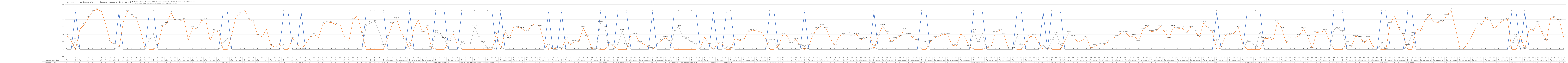
| Category | 1 = Strom reicht im Tagesdurchnitt aus | Zusätzlich benötigter Strom | Überschüssiger Strom |
|---|---|---|---|
| 0 | 0 | 0.36 | 0 |
| 1 | 0 | 0.23 | 0 |
| 2 | 1 | 0 | 0.25 |
| 3 | 0 | 0.54 | 0 |
| 4 | 0 | 0.66 | 0 |
| 5 | 0 | 0.85 | 0 |
| 6 | 0 | 1.02 | 0 |
| 7 | 0 | 1.07 | 0 |
| 8 | 0 | 1.01 | 0 |
| 9 | 0 | 0.65 | 0 |
| 10 | 0 | 0.21 | 0 |
| 11 | 0 | 0.12 | 0 |
| 12 | 1 | 0 | 0.09 |
| 13 | 0 | 0.73 | 0 |
| 14 | 0 | 1.02 | 0 |
| 15 | 0 | 0.9 | 0 |
| 16 | 0 | 0.83 | 0 |
| 17 | 0 | 0.49 | 0 |
| 18 | 0 | 0.02 | 0 |
| 19 | 1 | 0 | 0.25 |
| 20 | 1 | 0 | 0.4 |
| 21 | 0 | 0.1 | 0 |
| 22 | 0 | 0.61 | 0 |
| 23 | 0 | 0.69 | 0 |
| 24 | 0 | 0.98 | 0 |
| 25 | 0 | 0.76 | 0 |
| 26 | 0 | 0.76 | 0 |
| 27 | 0 | 0.8 | 0 |
| 28 | 0 | 0.25 | 0 |
| 29 | 0 | 0.58 | 0 |
| 30 | 0 | 0.55 | 0 |
| 31 | 0 | 0.77 | 0 |
| 32 | 0 | 0.79 | 0 |
| 33 | 0 | 0.23 | 0 |
| 34 | 0 | 0.5 | 0 |
| 35 | 0 | 0.47 | 0 |
| 36 | 1 | 0 | 0.16 |
| 37 | 1 | 0 | 0.3 |
| 38 | 0 | 0.39 | 0 |
| 39 | 0 | 0.89 | 0 |
| 40 | 0 | 0.95 | 0 |
| 41 | 0 | 1.05 | 0 |
| 42 | 0 | 0.8 | 0 |
| 43 | 0 | 0.74 | 0 |
| 44 | 0 | 0.37 | 0 |
| 45 | 0 | 0.34 | 0 |
| 46 | 0 | 0.54 | 0 |
| 47 | 0 | 0.11 | 0 |
| 48 | 0 | 0.06 | 0 |
| 49 | 0 | 0.13 | 0 |
| 50 | 1 | 0 | 0.14 |
| 51 | 1 | 0 | 0.01 |
| 52 | 0 | 0.29 | 0 |
| 53 | 0 | 0.16 | 0 |
| 54 | 1 | 0 | 0 |
| 55 | 0 | 0.14 | 0 |
| 56 | 0 | 0.32 | 0 |
| 57 | 0 | 0.39 | 0 |
| 58 | 0 | 0.32 | 0 |
| 59 | 0 | 0.68 | 0 |
| 60 | 0 | 0.71 | 0 |
| 61 | 0 | 0.72 | 0 |
| 62 | 0 | 0.66 | 0 |
| 63 | 0 | 0.65 | 0 |
| 64 | 0 | 0.33 | 0 |
| 65 | 0 | 0.22 | 0 |
| 66 | 0 | 0.8 | 0 |
| 67 | 0 | 0.9 | 0 |
| 68 | 0 | 0.43 | 0 |
| 69 | 1 | 0 | 0.63 |
| 70 | 1 | 0 | 0.71 |
| 71 | 1 | 0 | 0.75 |
| 72 | 1 | 0 | 0.46 |
| 73 | 1 | 0 | 0.11 |
| 74 | 0 | 0.335 | 0 |
| 75 | 0 | 0.683 | 0 |
| 76 | 0 | 0.822 | 0 |
| 77 | 0 | 0.459 | 0 |
| 78 | 0 | 0.265 | 0 |
| 79 | 1 | 0 | 0.195 |
| 80 | 0 | 0.568 | 0 |
| 81 | 0 | 0.78 | 0 |
| 82 | 0 | 0.454 | 0 |
| 83 | 0 | 0.6 | 0 |
| 84 | 0 | 0.055 | 0 |
| 85 | 1 | 0 | 0.484 |
| 86 | 1 | 0 | 0.402 |
| 87 | 1 | 0 | 0.297 |
| 88 | 0 | 0.206 | 0 |
| 89 | 0 | 0.437 | 0 |
| 90 | 0 | 0.115 | 0 |
| 91 | 1 | 0 | 0.189 |
| 92 | 1 | 0 | 0.142 |
| 93 | 1 | 0 | 0.144 |
| 94 | 1 | 0 | 0.606 |
| 95 | 1 | 0 | 0.315 |
| 96 | 1 | 0 | 0.189 |
| 97 | 1 | 0 | 0.021 |
| 98 | 1 | 0 | 0.059 |
| 99 | 0 | 0.428 | 0 |
| 100 | 1 | 0 | 0.063 |
| 101 | 0 | 0.473 | 0 |
| 102 | 0 | 0.298 | 0 |
| 103 | 0 | 0.597 | 0 |
| 104 | 0 | 0.587 | 0 |
| 105 | 0 | 0.546 | 0 |
| 106 | 0 | 0.465 | 0 |
| 107 | 0 | 0.616 | 0 |
| 108 | 0 | 0.701 | 0 |
| 109 | 0 | 0.61 | 0 |
| 110 | 0 | 0.166 | 0 |
| 111 | 1 | 0 | 0.17 |
| 112 | 0 | 0.034 | 0 |
| 113 | 0 | 0.014 | 0 |
| 114 | 1 | 0 | 0.016 |
| 115 | 0 | 0.277 | 0 |
| 116 | 0 | 0.123 | 0 |
| 117 | 0 | 0.2 | 0 |
| 118 | 0 | 0.21 | 0 |
| 119 | 0 | 0.573 | 0 |
| 120 | 0 | 0.335 | 0 |
| 121 | 0 | 0.028 | 0 |
| 122 | 0 | 0.003 | 0 |
| 123 | 1 | 0 | 0.71 |
| 124 | 1 | 0 | 0.582 |
| 125 | 0 | 0.155 | 0 |
| 126 | 0 | 0.092 | 0 |
| 127 | 1 | 0 | 0.142 |
| 128 | 1 | 0 | 0.5 |
| 129 | 1 | 0 | 0.131 |
| 130 | 0 | 0.379 | 0 |
| 131 | 0 | 0.395 | 0 |
| 132 | 0 | 0.188 | 0 |
| 133 | 0 | 0.143 | 0 |
| 134 | 0 | 0.064 | 0 |
| 135 | 1 | 0 | 0.021 |
| 136 | 0 | 0.129 | 0 |
| 137 | 0 | 0.236 | 0 |
| 138 | 0 | 0.309 | 0 |
| 139 | 0 | 0.217 | 0 |
| 140 | 1 | 0 | 0.482 |
| 141 | 1 | 0 | 0.617 |
| 142 | 1 | 0 | 0.307 |
| 143 | 1 | 0 | 0.283 |
| 144 | 1 | 0 | 0.189 |
| 145 | 1 | 0 | 0.138 |
| 146 | 0 | 0.052 | 0 |
| 147 | 0 | 0.329 | 0 |
| 148 | 0 | 0.128 | 0 |
| 149 | 1 | 0 | 0.035 |
| 150 | 0 | 0.156 | 0 |
| 151 | 0 | 0.146 | 0 |
| 152 | 1 | 0 | 0.05 |
| 153 | 1 | 0 | 0.014 |
| 154 | 0 | 0.307 | 0 |
| 155 | 0 | 0.234 | 0 |
| 156 | 0 | 0.255 | 0 |
| 157 | 0 | 0.469 | 0 |
| 158 | 0 | 0.512 | 0 |
| 159 | 0 | 0.495 | 0 |
| 160 | 0 | 0.461 | 0 |
| 161 | 0 | 0.3 | 0 |
| 162 | 1 | 0 | 0.274 |
| 163 | 1 | 0 | 0.243 |
| 164 | 0 | 0.101 | 0 |
| 165 | 0 | 0.393 | 0 |
| 166 | 0 | 0.369 | 0 |
| 167 | 0 | 0.144 | 0 |
| 168 | 0 | 0.27 | 0 |
| 169 | 0 | 0.095 | 0 |
| 170 | 1 | 0 | 0.077 |
| 171 | 0 | 0.095 | 0 |
| 172 | 0 | 0.406 | 0 |
| 173 | 0 | 0.563 | 0 |
| 174 | 0 | 0.63 | 0 |
| 175 | 0 | 0.556 | 0 |
| 176 | 0 | 0.273 | 0 |
| 177 | 0 | 0.11 | 0 |
| 178 | 0 | 0.355 | 0 |
| 179 | 0 | 0.403 | 0 |
| 180 | 0 | 0.415 | 0 |
| 181 | 0 | 0.351 | 0 |
| 182 | 0 | 0.399 | 0 |
| 183 | 0 | 0.258 | 0 |
| 184 | 0 | 0.293 | 0 |
| 185 | 0 | 0.408 | 0 |
| 186 | 1 | 0 | 0.065 |
| 187 | 0 | 0.367 | 0 |
| 188 | 0 | 0.629 | 0 |
| 189 | 0 | 0.448 | 0 |
| 190 | 0 | 0.191 | 0 |
| 191 | 0 | 0.281 | 0 |
| 192 | 0 | 0.35 | 0 |
| 193 | 0 | 0.528 | 0 |
| 194 | 0 | 0.402 | 0 |
| 195 | 0 | 0.31 | 0 |
| 196 | 0 | 0.235 | 0 |
| 197 | 1 | 0 | 0.063 |
| 198 | 1 | 0 | 0.187 |
| 199 | 0 | 0.206 | 0 |
| 200 | 0 | 0.309 | 0 |
| 201 | 0 | 0.354 | 0 |
| 202 | 0 | 0.404 | 0 |
| 203 | 0 | 0.388 | 0 |
| 204 | 0 | 0.11 | 0 |
| 205 | 0 | 0.093 | 0 |
| 206 | 0 | 0.41 | 0 |
| 207 | 0 | 0.329 | 0 |
| 208 | 0 | 0.066 | 0 |
| 209 | 1 | 0 | 0.493 |
| 210 | 1 | 0 | 0.182 |
| 211 | 1 | 0 | 0.433 |
| 212 | 0 | 0.042 | 0 |
| 213 | 0 | 0.071 | 0 |
| 214 | 0 | 0.441 | 0 |
| 215 | 0 | 0.51 | 0 |
| 216 | 0 | 0.389 | 0 |
| 217 | 0 | 0.012 | 0 |
| 218 | 0 | 0.011 | 0 |
| 219 | 1 | 0 | 0.358 |
| 220 | 1 | 0 | 0.112 |
| 221 | 0 | 0.184 | 0 |
| 222 | 0 | 0.34 | 0 |
| 223 | 0 | 0.36 | 0 |
| 224 | 0 | 0.168 | 0 |
| 225 | 1 | 0 | 0.116 |
| 226 | 0 | 0.036 | 0 |
| 227 | 1 | 0 | 0.242 |
| 228 | 1 | 0 | 0.43 |
| 229 | 1 | 0 | 0.129 |
| 230 | 0 | 0.223 | 0 |
| 231 | 0 | 0.451 | 0 |
| 232 | 0 | 0.331 | 0 |
| 233 | 0 | 0.194 | 0 |
| 234 | 0 | 0.249 | 0 |
| 235 | 0 | 0.314 | 0 |
| 236 | 0 | 0.019 | 0 |
| 237 | 0 | 0.095 | 0 |
| 238 | 0 | 0.122 | 0 |
| 239 | 0 | 0.118 | 0 |
| 240 | 0 | 0.198 | 0 |
| 241 | 0 | 0.302 | 0 |
| 242 | 0 | 0.341 | 0 |
| 243 | 0 | 0.444 | 0 |
| 244 | 0 | 0.445 | 0 |
| 245 | 0 | 0.329 | 0 |
| 246 | 0 | 0.361 | 0 |
| 247 | 0 | 0.216 | 0 |
| 248 | 0 | 0.534 | 0 |
| 249 | 0 | 0.615 | 0 |
| 250 | 0 | 0.472 | 0 |
| 251 | 0 | 0.495 | 0 |
| 252 | 0 | 0.613 | 0 |
| 253 | 0 | 0.47 | 0 |
| 254 | 0 | 0.296 | 0 |
| 255 | 0 | 0.6 | 0 |
| 256 | 0 | 0.55 | 0 |
| 257 | 0 | 0.576 | 0 |
| 258 | 0 | 0.432 | 0 |
| 259 | 0 | 0.59 | 0 |
| 260 | 0 | 0.477 | 0 |
| 261 | 0 | 0.331 | 0 |
| 262 | 0 | 0.714 | 0 |
| 263 | 0 | 0.548 | 0 |
| 264 | 0 | 0.476 | 0 |
| 265 | 1 | 0 | 0.242 |
| 266 | 0 | 0.041 | 0 |
| 267 | 0 | 0.369 | 0 |
| 268 | 0 | 0.396 | 0 |
| 269 | 0 | 0.43 | 0 |
| 270 | 0 | 0.579 | 0 |
| 271 | 0 | 0.143 | 0 |
| 272 | 1 | 0 | 0.215 |
| 273 | 1 | 0 | 0.205 |
| 274 | 1 | 0 | 0.042 |
| 275 | 1 | 0 | 0.487 |
| 276 | 0 | 0.297 | 0 |
| 277 | 0 | 0.287 | 0 |
| 278 | 0 | 0.249 | 0 |
| 279 | 0 | 0.736 | 0 |
| 280 | 0 | 0.554 | 0 |
| 281 | 0 | 0.174 | 0 |
| 282 | 0 | 0.313 | 0 |
| 283 | 0 | 0.303 | 0 |
| 284 | 0 | 0.365 | 0 |
| 285 | 0 | 0.552 | 0 |
| 286 | 0 | 0.346 | 0 |
| 287 | 0 | 0.022 | 0 |
| 288 | 0 | 0.449 | 0 |
| 289 | 0 | 0.462 | 0 |
| 290 | 0 | 0.506 | 0 |
| 291 | 0 | 0.219 | 0 |
| 292 | 1 | 0 | 0.525 |
| 293 | 1 | 0 | 0.56 |
| 294 | 1 | 0 | 0.482 |
| 295 | 0 | 0.183 | 0 |
| 296 | 0 | 0.07 | 0 |
| 297 | 0 | 0.347 | 0 |
| 298 | 0 | 0.322 | 0 |
| 299 | 0 | 0.176 | 0 |
| 300 | 0 | 0.307 | 0 |
| 301 | 0 | 0.088 | 0 |
| 302 | 0 | 0.004 | 0 |
| 303 | 1 | 0 | 0.154 |
| 304 | 1 | 0 | 0 |
| 305 | 0 | 0.696 | 0 |
| 306 | 0 | 0.891 | 0 |
| 307 | 0 | 0.545 | 0 |
| 308 | 0 | 0.397 | 0 |
| 309 | 1 | 0 | 0.095 |
| 310 | 1 | 0 | 0.413 |
| 311 | 0 | 0.542 | 0 |
| 312 | 0 | 0.503 | 0 |
| 313 | 0 | 0.771 | 0 |
| 314 | 0 | 0.911 | 0 |
| 315 | 0 | 0.73 | 0 |
| 316 | 0 | 0.72 | 0 |
| 317 | 0 | 0.733 | 0 |
| 318 | 0 | 0.898 | 0 |
| 319 | 0 | 1.051 | 0 |
| 320 | 0 | 0.577 | 0 |
| 321 | 0 | 0.051 | 0 |
| 322 | 0 | 0.022 | 0 |
| 323 | 0 | 0.193 | 0 |
| 324 | 0 | 0.41 | 0 |
| 325 | 0 | 0.658 | 0 |
| 326 | 0 | 0.661 | 0 |
| 327 | 0 | 0.832 | 0 |
| 328 | 0 | 0.752 | 0 |
| 329 | 0 | 0.544 | 0 |
| 330 | 0 | 0.686 | 0 |
| 331 | 0 | 0.772 | 0 |
| 332 | 0 | 0.8 | 0 |
| 333 | 1 | 0 | 0.157 |
| 334 | 1 | 0 | 0.366 |
| 335 | 0 | 0.354 | 0 |
| 336 | 1 | 0 | 0.028 |
| 337 | 0 | 0.549 | 0 |
| 338 | 0 | 0.499 | 0 |
| 339 | 0 | 0.721 | 0 |
| 340 | 0 | 0.439 | 0 |
| 341 | 0 | 0.244 | 0 |
| 342 | 0 | 0.864 | 0 |
| 343 | 0 | 0.844 | 0 |
| 344 | 0 | 0.761 | 0 |
| 345 | 0 | 0.299 | 0 |